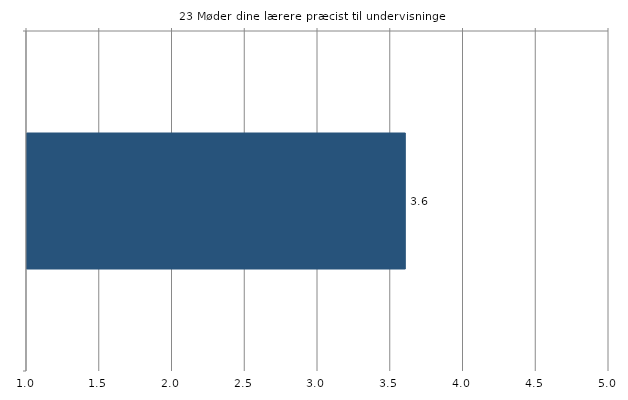
| Category | Gns. |
|---|---|
|   | 3.6 |